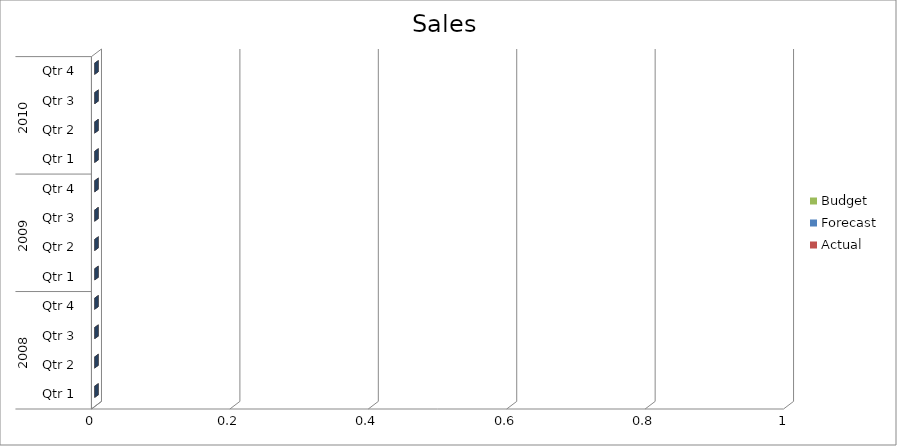
| Category | Budget | Forecast | Actual |
|---|---|---|---|
| 0 | 1680 | 1310 | 680 |
| 1 | 1350 | 820 | 3470 |
| 2 | 640 | 840 | 2080 |
| 3 | 2410 | 540 | 2590 |
| 4 | 3020 | 1340 | 2700 |
| 5 | 560 | 1980 | 3030 |
| 6 | 860 | 1800 | 1780 |
| 7 | 3500 | 2270 | 1960 |
| 8 | 1850 | 2670 | 2490 |
| 9 | 1640 | 1650 | 1260 |
| 10 | 2150 | 1820 | 2000 |
| 11 | 1350 | 2850 | 840 |